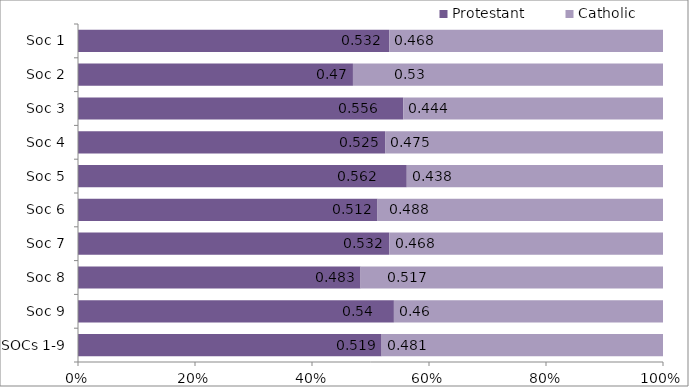
| Category | Protestant | Catholic |
|---|---|---|
| SOCs 1-9 | 0.519 | 0.481 |
| Soc 9 | 0.54 | 0.46 |
| Soc 8 | 0.483 | 0.517 |
| Soc 7 | 0.532 | 0.468 |
| Soc 6 | 0.512 | 0.488 |
| Soc 5 | 0.562 | 0.438 |
| Soc 4 | 0.525 | 0.475 |
| Soc 3 | 0.556 | 0.444 |
| Soc 2 | 0.47 | 0.53 |
| Soc 1 | 0.532 | 0.468 |